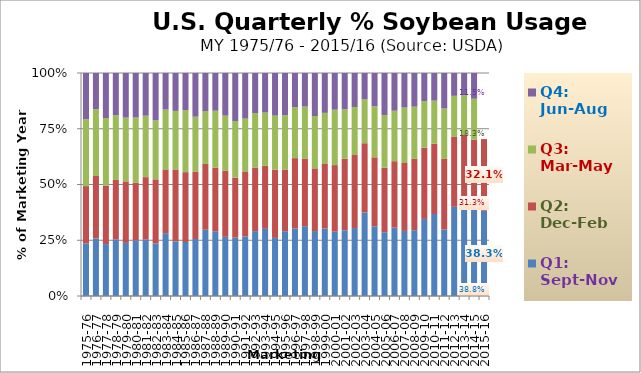
| Category | Q1: Sept-Nov | Q2: Dec-Feb | Q3: Mar-May | Q4: Jun-Aug |
|---|---|---|---|---|
| 1975-76 | 0.235 | 0.257 | 0.299 | 0.208 |
| 1976-77 | 0.259 | 0.282 | 0.297 | 0.163 |
| 1977-78 | 0.233 | 0.263 | 0.303 | 0.202 |
| 1978-79 | 0.254 | 0.267 | 0.291 | 0.189 |
| 1979-80 | 0.238 | 0.276 | 0.286 | 0.2 |
| 1980-81 | 0.25 | 0.259 | 0.291 | 0.2 |
| 1981-82 | 0.254 | 0.279 | 0.276 | 0.191 |
| 1982-83 | 0.235 | 0.288 | 0.264 | 0.212 |
| 1983-84 | 0.282 | 0.286 | 0.268 | 0.164 |
| 1984-85 | 0.245 | 0.322 | 0.262 | 0.17 |
| 1985-86 | 0.242 | 0.313 | 0.278 | 0.166 |
| 1986-87 | 0.256 | 0.302 | 0.246 | 0.196 |
| 1987-88 | 0.297 | 0.295 | 0.237 | 0.171 |
| 1988-89 | 0.29 | 0.285 | 0.255 | 0.169 |
| 1989-90 | 0.265 | 0.297 | 0.246 | 0.191 |
| 1990-91 | 0.262 | 0.269 | 0.254 | 0.215 |
| 1991-92 | 0.267 | 0.292 | 0.237 | 0.205 |
| 1992-93 | 0.291 | 0.285 | 0.244 | 0.18 |
| 1993-94 | 0.301 | 0.282 | 0.239 | 0.177 |
| 1994-95 | 0.261 | 0.306 | 0.242 | 0.191 |
| 1995-96 | 0.291 | 0.277 | 0.244 | 0.189 |
| 1996-97 | 0.303 | 0.315 | 0.228 | 0.154 |
| 1997-98 | 0.313 | 0.304 | 0.233 | 0.151 |
| 1998-99 | 0.291 | 0.281 | 0.235 | 0.193 |
| 1999-00 | 0.302 | 0.29 | 0.229 | 0.179 |
| 2000-01 | 0.288 | 0.298 | 0.248 | 0.165 |
| 2001-02 | 0.294 | 0.321 | 0.222 | 0.163 |
| 2002-03 | 0.305 | 0.328 | 0.215 | 0.152 |
| 2003-04 | 0.375 | 0.311 | 0.197 | 0.118 |
| 2004-05 | 0.312 | 0.31 | 0.229 | 0.149 |
| 2005-06 | 0.286 | 0.289 | 0.236 | 0.188 |
| 2006-07 | 0.307 | 0.297 | 0.226 | 0.169 |
| 2007-08 | 0.292 | 0.304 | 0.249 | 0.155 |
| 2008-09 | 0.295 | 0.321 | 0.233 | 0.151 |
| 2009-10 | 0.346 | 0.32 | 0.209 | 0.126 |
| 2010-11 | 0.368 | 0.315 | 0.193 | 0.124 |
| 2011-12 | 0.298 | 0.316 | 0.226 | 0.159 |
| 2012-13 | 0.4 | 0.314 | 0.184 | 0.102 |
| 2013-14 | 0.389 | 0.336 | 0.177 | 0.099 |
| 2014-15 | 0.388 | 0.313 | 0.183 | 0.115 |
| 2015-16 | 0.383 | 0.321 | 0 | 0 |